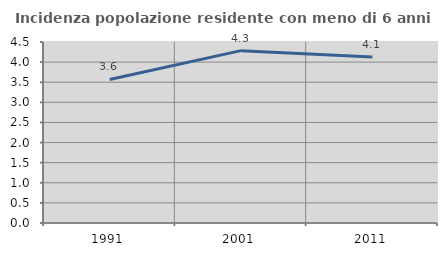
| Category | Incidenza popolazione residente con meno di 6 anni |
|---|---|
| 1991.0 | 3.568 |
| 2001.0 | 4.285 |
| 2011.0 | 4.125 |